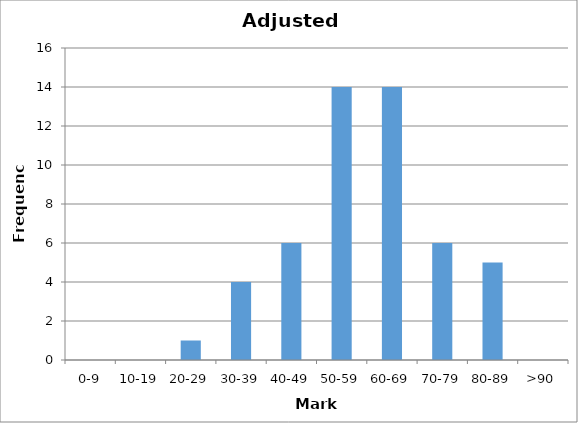
| Category | Series 0 |
|---|---|
| 0-9 | 0 |
| 10-19 | 0 |
| 20-29 | 1 |
| 30-39 | 4 |
| 40-49 | 6 |
| 50-59 | 14 |
| 60-69 | 14 |
| 70-79 | 6 |
| 80-89 | 5 |
| >90 | 0 |